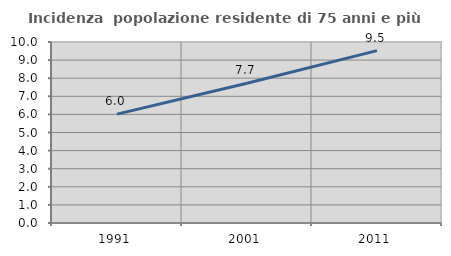
| Category | Incidenza  popolazione residente di 75 anni e più |
|---|---|
| 1991.0 | 6.017 |
| 2001.0 | 7.722 |
| 2011.0 | 9.523 |